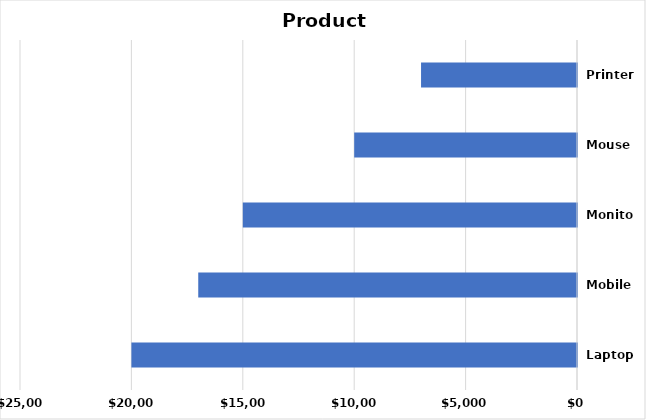
| Category | Sales |
|---|---|
| Laptop | 20000 |
| Mobile | 17000 |
| Monitor | 15000 |
| Mouse | 10000 |
| Printer | 7000 |